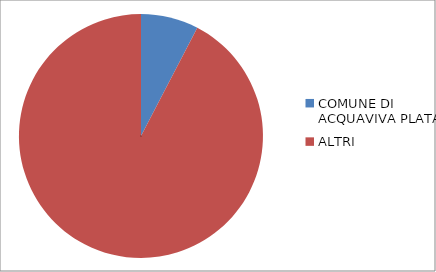
| Category | Series 0 |
|---|---|
| COMUNE DI ACQUAVIVA PLATANI | 0.076 |
| ALTRI | 0.924 |